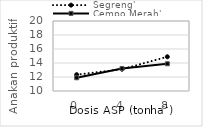
| Category | Segreng' | Cempo Merah' |
|---|---|---|
| 0.0 | 12.33 | 11.89 |
| 4.0 | 13.11 | 13.22 |
| 8.0 | 14.89 | 13.89 |